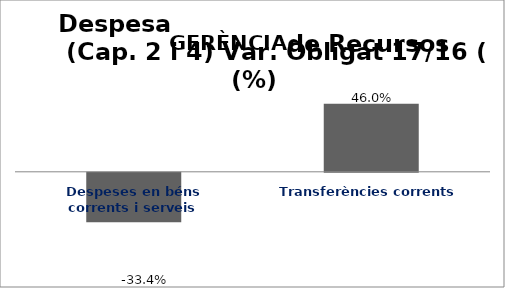
| Category | Series 0 |
|---|---|
| Despeses en béns corrents i serveis | -0.334 |
| Transferències corrents | 0.46 |